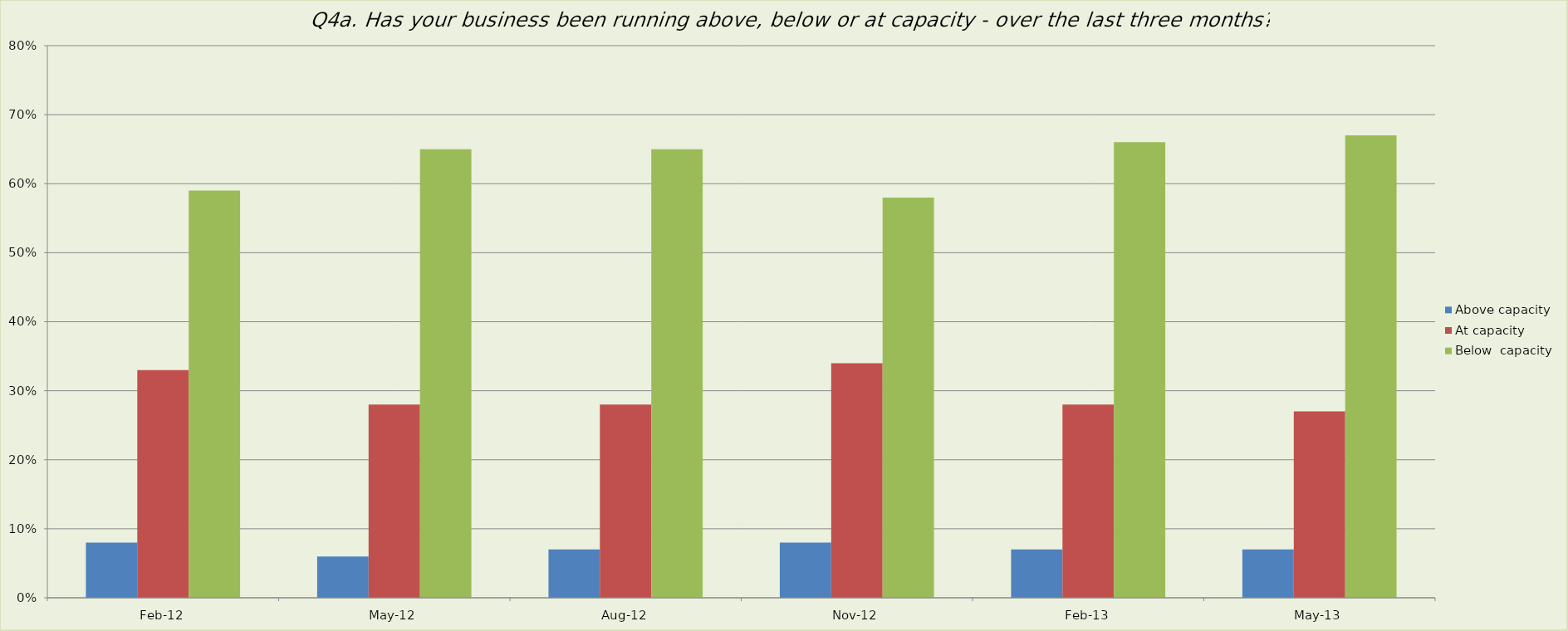
| Category | Above capacity | At capacity | Below  capacity |
|---|---|---|---|
| 2012-02-01 | 0.08 | 0.33 | 0.59 |
| 2012-05-01 | 0.06 | 0.28 | 0.65 |
| 2012-08-01 | 0.07 | 0.28 | 0.65 |
| 2012-11-01 | 0.08 | 0.34 | 0.58 |
| 2013-02-01 | 0.07 | 0.28 | 0.66 |
| 2013-05-01 | 0.07 | 0.27 | 0.67 |